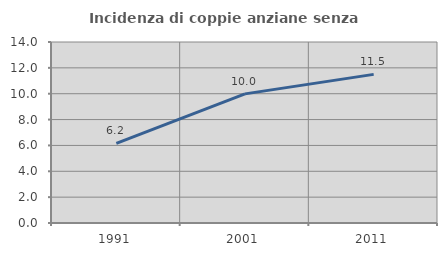
| Category | Incidenza di coppie anziane senza figli  |
|---|---|
| 1991.0 | 6.163 |
| 2001.0 | 9.987 |
| 2011.0 | 11.496 |